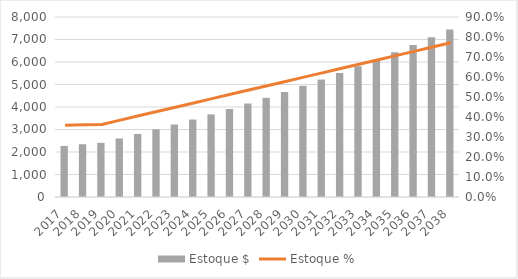
| Category | Estoque $ |
|---|---|
| 2017.0 | 2269.312 |
| 2018.0 | 2344.957 |
| 2019.0 | 2406.517 |
| 2020.0 | 2599.904 |
| 2021.0 | 2800.064 |
| 2022.0 | 3007.19 |
| 2023.0 | 3221.481 |
| 2024.0 | 3443.141 |
| 2025.0 | 3672.379 |
| 2026.0 | 3909.409 |
| 2027.0 | 4154.451 |
| 2028.0 | 4407.731 |
| 2029.0 | 4669.481 |
| 2030.0 | 4939.938 |
| 2031.0 | 5219.345 |
| 2032.0 | 5507.952 |
| 2033.0 | 5806.016 |
| 2034.0 | 6113.799 |
| 2035.0 | 6431.571 |
| 2036.0 | 6759.608 |
| 2037.0 | 7098.195 |
| 2038.0 | 7447.621 |